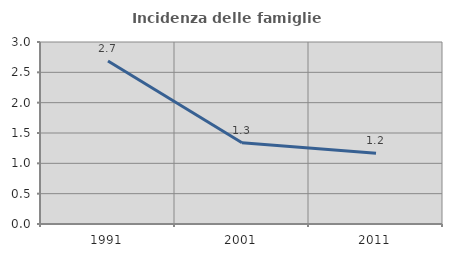
| Category | Incidenza delle famiglie numerose |
|---|---|
| 1991.0 | 2.687 |
| 2001.0 | 1.338 |
| 2011.0 | 1.165 |